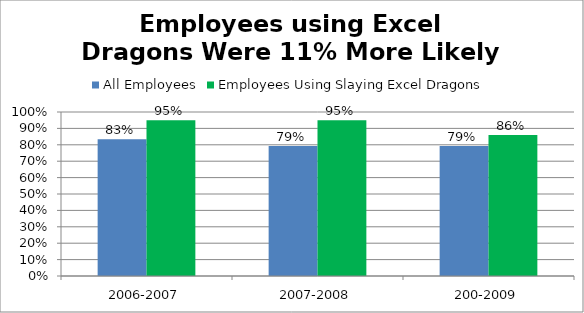
| Category | All Employees | Employees Using Slaying Excel Dragons |
|---|---|---|
| 2006-2007 | 0.834 | 0.95 |
| 2007-2008 | 0.792 | 0.95 |
| 200-2009 | 0.793 | 0.86 |